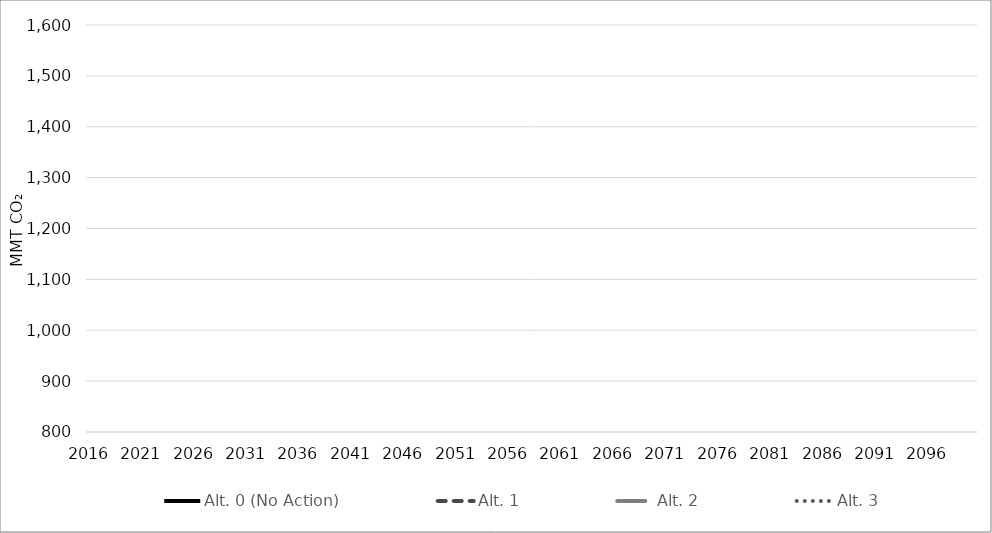
| Category | Alt. 0 (No Action) | Alt. 1 | Alt. 2 | Alt. 3 |
|---|---|---|---|---|
| 2016.0 | 193.479 | 193.479 | 193.479 | 193.479 |
| 2017.0 | 192.435 | 192.435 | 192.435 | 192.435 |
| 2018.0 | 191.39 | 191.39 | 191.39 | 191.39 |
| 2019.0 | 190.345 | 190.345 | 190.345 | 190.345 |
| 2020.0 | 189.301 | 189.301 | 189.301 | 189.301 |
| 2021.0 | 188.256 | 188.256 | 188.256 | 188.256 |
| 2022.0 | 186.311 | 186.311 | 186.311 | 186.311 |
| 2023.0 | 185.738 | 185.738 | 185.738 | 185.738 |
| 2024.0 | 183.938 | 183.938 | 183.938 | 183.938 |
| 2025.0 | 183.389 | 183.389 | 183.389 | 183.389 |
| 2026.0 | 183.412 | 183.412 | 183.412 | 183.412 |
| 2027.0 | 183.345 | 183.345 | 183.345 | 183.345 |
| 2028.0 | 182.85 | 182.85 | 182.85 | 182.85 |
| 2029.0 | 182.907 | 182.907 | 182.907 | 182.907 |
| 2030.0 | 180.18 | 180.177 | 180.171 | 180.161 |
| 2031.0 | 176.631 | 176.627 | 176.609 | 176.285 |
| 2032.0 | 173.176 | 173.169 | 173.14 | 172.541 |
| 2033.0 | 168.914 | 168.903 | 168.707 | 167.66 |
| 2034.0 | 164.89 | 164.873 | 164.522 | 163.064 |
| 2035.0 | 161.361 | 161.34 | 160.841 | 158.778 |
| 2036.0 | 157.484 | 157.46 | 156.802 | 154.171 |
| 2037.0 | 153.761 | 153.733 | 152.926 | 149.715 |
| 2038.0 | 150.391 | 150.36 | 149.413 | 145.659 |
| 2039.0 | 147.38 | 147.348 | 146.283 | 142.005 |
| 2040.0 | 144.669 | 144.633 | 143.469 | 138.696 |
| 2041.0 | 142.303 | 142.259 | 140.997 | 135.855 |
| 2042.0 | 140.232 | 140.182 | 138.83 | 133.332 |
| 2043.0 | 137.974 | 137.915 | 136.486 | 130.897 |
| 2044.0 | 136.01 | 135.943 | 134.443 | 128.765 |
| 2045.0 | 134.292 | 134.219 | 132.653 | 126.923 |
| 2046.0 | 132.727 | 132.647 | 131.025 | 125.259 |
| 2047.0 | 130.669 | 130.588 | 128.919 | 123.287 |
| 2048.0 | 128.821 | 128.74 | 127.026 | 121.511 |
| 2049.0 | 127.02 | 126.941 | 125.192 | 119.926 |
| 2050.0 | 125.297 | 125.221 | 123.443 | 118.417 |
| 2051.0 | 125.233 | 125.156 | 123.38 | 118.356 |
| 2052.0 | 125.169 | 125.092 | 123.316 | 118.295 |
| 2053.0 | 125.104 | 125.028 | 123.253 | 118.234 |
| 2054.0 | 125.04 | 124.963 | 123.189 | 118.174 |
| 2055.0 | 124.975 | 124.899 | 123.126 | 118.113 |
| 2056.0 | 124.911 | 124.835 | 123.062 | 118.052 |
| 2057.0 | 124.847 | 124.77 | 122.999 | 117.991 |
| 2058.0 | 124.782 | 124.706 | 122.936 | 117.93 |
| 2059.0 | 124.718 | 124.642 | 122.872 | 117.869 |
| 2060.0 | 124.653 | 124.577 | 122.809 | 117.808 |
| 2061.0 | 124.589 | 124.513 | 122.745 | 117.748 |
| 2062.0 | 124.525 | 124.449 | 122.682 | 117.687 |
| 2063.0 | 124.46 | 124.384 | 122.618 | 117.626 |
| 2064.0 | 124.396 | 124.32 | 122.555 | 117.565 |
| 2065.0 | 124.331 | 124.255 | 122.491 | 117.504 |
| 2066.0 | 124.294 | 124.218 | 122.455 | 117.469 |
| 2067.0 | 124.257 | 124.181 | 122.418 | 117.434 |
| 2068.0 | 124.22 | 124.144 | 122.382 | 117.399 |
| 2069.0 | 124.183 | 124.107 | 122.345 | 117.364 |
| 2070.0 | 124.146 | 124.07 | 122.308 | 117.329 |
| 2071.0 | 124.109 | 124.033 | 122.272 | 117.293 |
| 2072.0 | 124.071 | 123.996 | 122.235 | 117.258 |
| 2073.0 | 124.034 | 123.959 | 122.199 | 117.223 |
| 2074.0 | 123.997 | 123.921 | 122.162 | 117.188 |
| 2075.0 | 123.96 | 123.884 | 122.125 | 117.153 |
| 2076.0 | 123.923 | 123.847 | 122.089 | 117.118 |
| 2077.0 | 123.886 | 123.81 | 122.052 | 117.083 |
| 2078.0 | 123.849 | 123.773 | 122.016 | 117.048 |
| 2079.0 | 123.811 | 123.736 | 121.979 | 117.013 |
| 2080.0 | 123.774 | 123.699 | 121.943 | 116.978 |
| 2081.0 | 123.197 | 123.122 | 121.374 | 116.432 |
| 2082.0 | 122.621 | 122.546 | 120.806 | 115.887 |
| 2083.0 | 122.044 | 121.969 | 120.238 | 115.342 |
| 2084.0 | 121.467 | 121.393 | 119.669 | 114.797 |
| 2085.0 | 120.89 | 120.816 | 119.101 | 114.252 |
| 2086.0 | 120.313 | 120.24 | 118.533 | 113.706 |
| 2087.0 | 119.736 | 119.663 | 117.964 | 113.161 |
| 2088.0 | 119.159 | 119.087 | 117.396 | 112.616 |
| 2089.0 | 118.583 | 118.51 | 116.828 | 112.071 |
| 2090.0 | 118.006 | 117.934 | 116.259 | 111.526 |
| 2091.0 | 117.429 | 117.357 | 115.691 | 110.981 |
| 2092.0 | 116.852 | 116.781 | 115.123 | 110.435 |
| 2093.0 | 116.275 | 116.204 | 114.554 | 109.89 |
| 2094.0 | 115.698 | 115.628 | 113.986 | 109.345 |
| 2095.0 | 115.121 | 115.051 | 113.418 | 108.8 |
| 2096.0 | 115.121 | 115.051 | 113.418 | 108.8 |
| 2097.0 | 115.121 | 115.051 | 113.418 | 108.8 |
| 2098.0 | 115.121 | 115.051 | 113.418 | 108.8 |
| 2099.0 | 115.121 | 115.051 | 113.418 | 108.8 |
| 2100.0 | 115.121 | 115.051 | 113.418 | 108.8 |